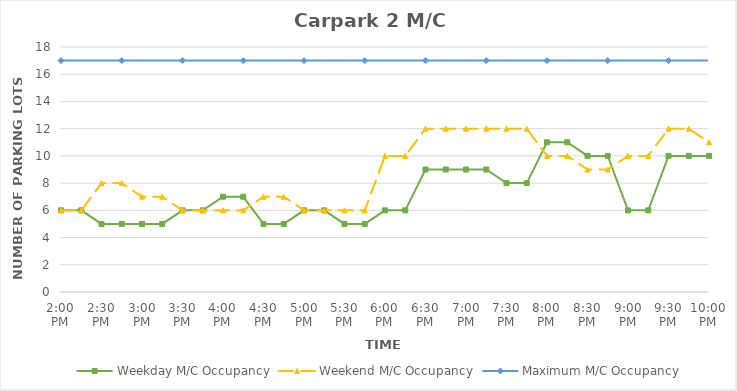
| Category | Weekday M/C Occupancy | Weekend M/C Occupancy | Maximum M/C Occupancy |
|---|---|---|---|
| 0.5833333333333334 | 6 | 6 | 17 |
| 0.59375 | 6 | 6 | 17 |
| 0.604166666666667 | 5 | 8 | 17 |
| 0.614583333333333 | 5 | 8 | 17 |
| 0.625 | 5 | 7 | 17 |
| 0.635416666666666 | 5 | 7 | 17 |
| 0.645833333333333 | 6 | 6 | 17 |
| 0.65625 | 6 | 6 | 17 |
| 0.666666666666666 | 7 | 6 | 17 |
| 0.677083333333333 | 7 | 6 | 17 |
| 0.6875 | 5 | 7 | 17 |
| 0.697916666666666 | 5 | 7 | 17 |
| 0.708333333333333 | 6 | 6 | 17 |
| 0.718749999999999 | 6 | 6 | 17 |
| 0.729166666666666 | 5 | 6 | 17 |
| 0.739583333333333 | 5 | 6 | 17 |
| 0.75 | 6 | 10 | 17 |
| 0.7604166666666666 | 6 | 10 | 17 |
| 0.7708333333333334 | 9 | 12 | 17 |
| 0.78125 | 9 | 12 | 17 |
| 0.7916666666666666 | 9 | 12 | 17 |
| 0.8020833333333334 | 9 | 12 | 17 |
| 0.8125 | 8 | 12 | 17 |
| 0.8229166666666666 | 8 | 12 | 17 |
| 0.8333333333333334 | 11 | 10 | 17 |
| 0.84375 | 11 | 10 | 17 |
| 0.8541666666666666 | 10 | 9 | 17 |
| 0.8645833333333334 | 10 | 9 | 17 |
| 0.875 | 6 | 10 | 17 |
| 0.8854166666666666 | 6 | 10 | 17 |
| 0.8958333333333334 | 10 | 12 | 17 |
| 0.90625 | 10 | 12 | 17 |
| 0.9166666666666666 | 10 | 11 | 17 |